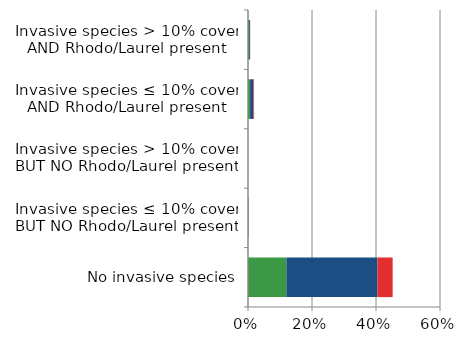
| Category | England | Scotland | Wales |
|---|---|---|---|
| No invasive species | 0.12 | 0.285 | 0.047 |
| Invasive species ≤ 10% cover BUT NO Rhodo/Laurel present | 0.001 | 0.001 | 0.001 |
| Invasive species > 10% cover BUT NO Rhodo/Laurel present | 0 | 0 | 0 |
| Invasive species ≤ 10% cover AND Rhodo/Laurel present | 0.007 | 0.01 | 0.002 |
| Invasive species > 10% cover AND Rhodo/Laurel present | 0.003 | 0.003 | 0.001 |